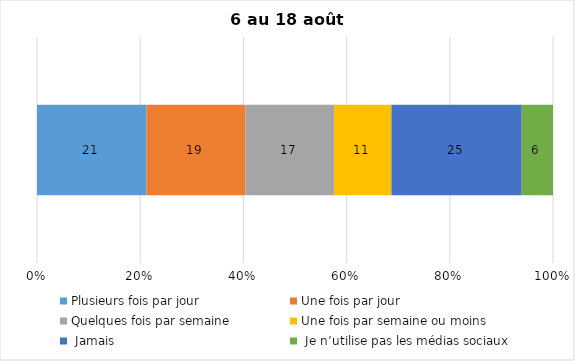
| Category | Plusieurs fois par jour | Une fois par jour | Quelques fois par semaine   | Une fois par semaine ou moins   |  Jamais   |  Je n’utilise pas les médias sociaux |
|---|---|---|---|---|---|---|
| 0 | 21 | 19 | 17 | 11 | 25 | 6 |